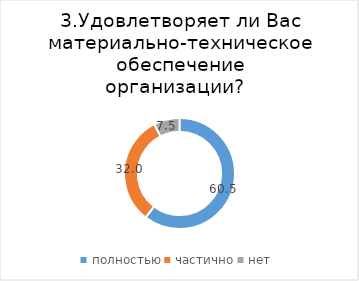
| Category | Series 0 |
|---|---|
| полностью | 60.458 |
| частично | 32.026 |
| нет | 7.516 |